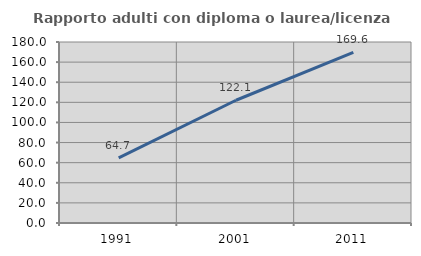
| Category | Rapporto adulti con diploma o laurea/licenza media  |
|---|---|
| 1991.0 | 64.744 |
| 2001.0 | 122.086 |
| 2011.0 | 169.62 |